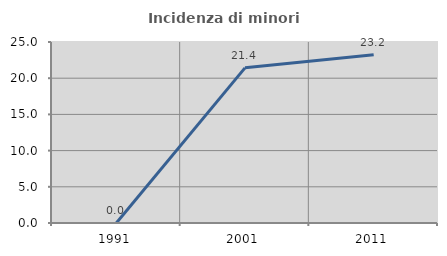
| Category | Incidenza di minori stranieri |
|---|---|
| 1991.0 | 0 |
| 2001.0 | 21.429 |
| 2011.0 | 23.239 |